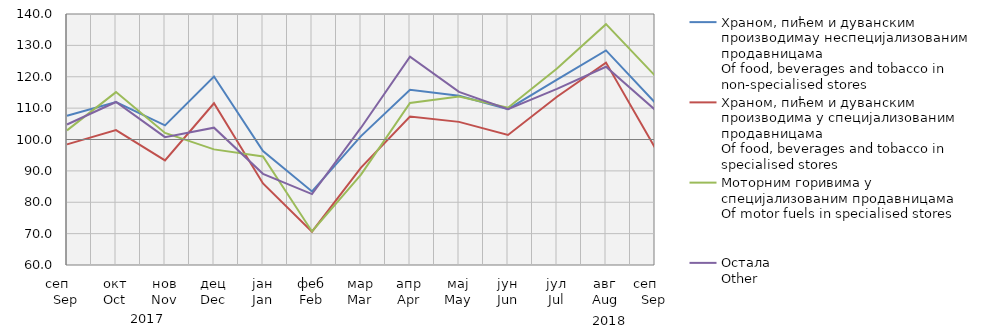
| Category | Храном, пићем и дуванским производимау неспецијализованим продавницама
Of food, beverages and tobacco in non-specialised stores
 | Храном, пићем и дуванским производима у специјализовaним продавницама
Of food, beverages and tobacco in specialised stores | Моторним горивима у специјализованим продавницама
Of motor fuels in specialised stores | Остала
Other |
|---|---|---|---|---|
| сеп     Sep | 107.568 | 98.457 | 102.908 | 104.789 |
| окт
Oct | 111.938 | 102.999 | 115.109 | 111.951 |
| нов
Nov | 104.514 | 93.335 | 102.083 | 100.762 |
| дец
Dec | 120.059 | 111.537 | 96.853 | 103.773 |
| јан
Jan | 96.298 | 85.996 | 94.588 | 89.066 |
| феб
Feb | 83.434 | 70.608 | 70.699 | 82.588 |
| мар
Mar | 101.078 | 91.052 | 88.818 | 103.76 |
| апр
Apr | 115.827 | 107.304 | 111.624 | 126.386 |
| мај
May | 113.922 | 105.62 | 113.677 | 115.161 |
| јун
Jun | 109.695 | 101.443 | 110.116 | 109.637 |
| јул
Jul | 119.106 | 113.628 | 122.61 | 116.148 |
| авг
Aug | 128.392 | 124.508 | 136.768 | 123.178 |
| сеп     Sep | 111.785 | 97.362 | 120.346 | 109.489 |